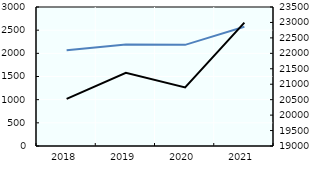
| Category | IRPP |
|---|---|
| 2018.0 | 2063.982 |
| 2019.0 | 2192.995 |
| 2020.0 | 2183.169 |
| 2021.0 | 2574.306 |